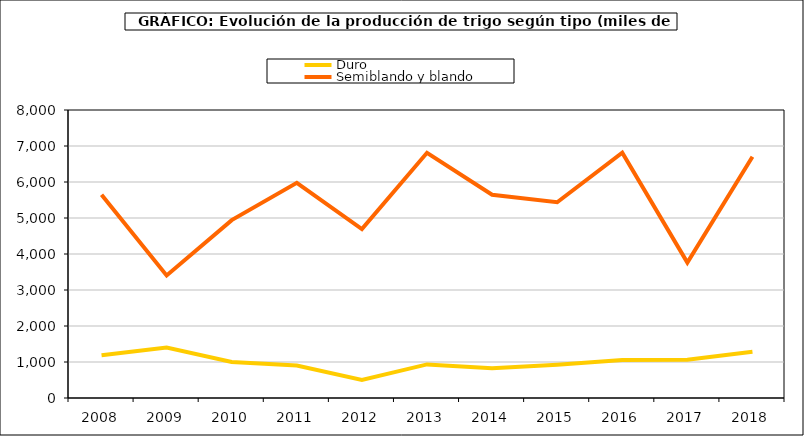
| Category | Duro | Semiblando y blando |
|---|---|---|
| 2008 | 1184.844 | 5646.617 |
| 2009 | 1401.499 | 3403.273 |
| 2010 | 999.861 | 4941.336 |
| 2011 | 900.352 | 5976.299 |
| 2012 | 499.493 | 4690.335 |
| 2013 | 933.268 | 6811.661 |
| 2014 | 825.433 | 5647.301 |
| 2015 | 924.956 | 5437.736 |
| 2016 | 1057.913 | 6815.222 |
| 2017 | 1061.648 | 3763.461 |
| 2018 | 1282.494 | 6703.231 |